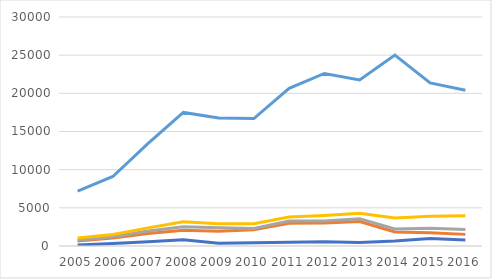
| Category |       Insurance and pension services |       Financial services |       Charges for the use of intellectual property n.i.e. |       Telecommunications, computer, and information services |       Other business services |
|---|---|---|---|---|---|
| 2005.0 | 134.152 | 507.167 | 101.66 | 319.362 | 6115.81 |
| 2006.0 | 324.459 | 737.713 | 150.307 | 291.137 | 7600.4 |
| 2007.0 | 542.818 | 1090.05 | 319.41 | 419.438 | 11063.7 |
| 2008.0 | 828.094 | 1237.58 | 465.444 | 640.648 | 14330.8 |
| 2009.0 | 372.623 | 1570.39 | 433.808 | 537.906 | 13866.7 |
| 2010.0 | 416.03 | 1699.37 | 189.606 | 611.184 | 13772.5 |
| 2011.0 | 504.568 | 2477.62 | 300.8 | 523.449 | 16857.8 |
| 2012.0 | 540.699 | 2459.94 | 276.418 | 731.699 | 18597.1 |
| 2013.0 | 472.857 | 2742.62 | 368.128 | 707.885 | 17461.563 |
| 2014.0 | 668.79 | 1175.7 | 375.098 | 1446.46 | 21351.2 |
| 2015.0 | 987.552 | 742.367 | 581.081 | 1571.48 | 17490.3 |
| 2016.0 | 783.65 | 739.089 | 650.834 | 1803.756 | 16423.392 |